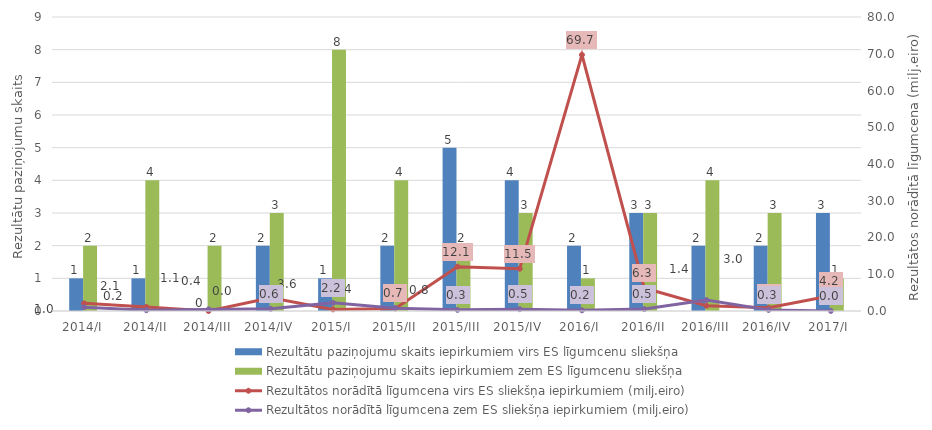
| Category | Rezultātu paziņojumu skaits iepirkumiem virs ES līgumcenu sliekšņa | Rezultātu paziņojumu skaits iepirkumiem zem ES līgumcenu sliekšņa |
|---|---|---|
| 2014/I | 1 | 2 |
| 2014/II | 1 | 4 |
| 2014/III | 0 | 2 |
| 2014/IV | 2 | 3 |
| 2015/I | 1 | 8 |
| 2015/II | 2 | 4 |
| 2015/III | 5 | 2 |
| 2015/IV | 4 | 3 |
| 2016/I | 2 | 1 |
| 2016/II | 3 | 3 |
| 2016/III | 2 | 4 |
| 2016/IV | 2 | 3 |
| 2017/I | 3 | 1 |